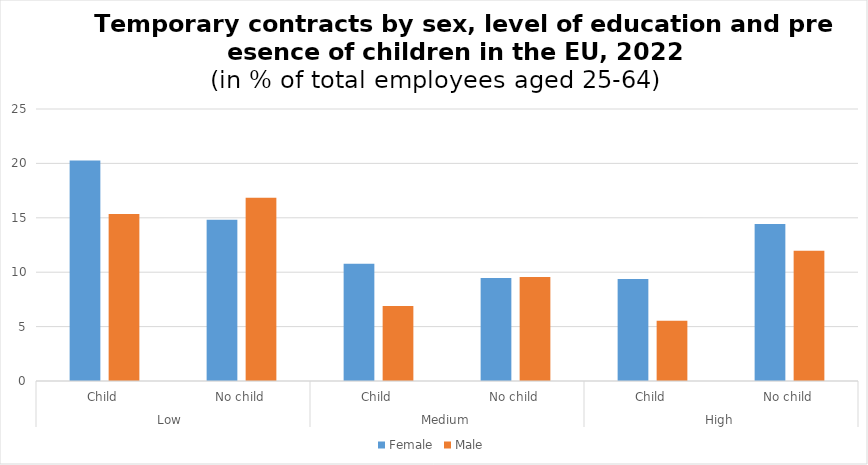
| Category | Female | Male |
|---|---|---|
| 0 | 20.268 | 15.348 |
| 1 | 14.813 | 16.835 |
| 2 | 10.782 | 6.891 |
| 3 | 9.471 | 9.557 |
| 4 | 9.38 | 5.543 |
| 5 | 14.429 | 11.973 |